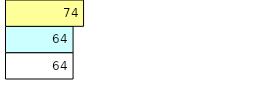
| Category | Total Standouts | Total Recd | Total Tipsters |
|---|---|---|---|
| 0 | 64 | 64 | 74 |